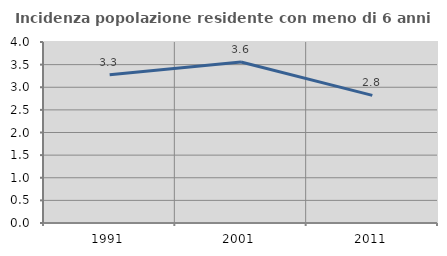
| Category | Incidenza popolazione residente con meno di 6 anni |
|---|---|
| 1991.0 | 3.279 |
| 2001.0 | 3.558 |
| 2011.0 | 2.821 |